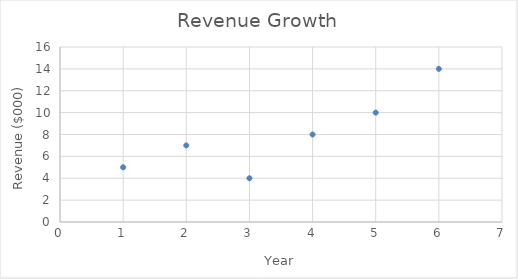
| Category | Revenue |
|---|---|
| 1.0 | 5 |
| 2.0 | 7 |
| 3.0 | 4 |
| 4.0 | 8 |
| 5.0 | 10 |
| 6.0 | 14 |